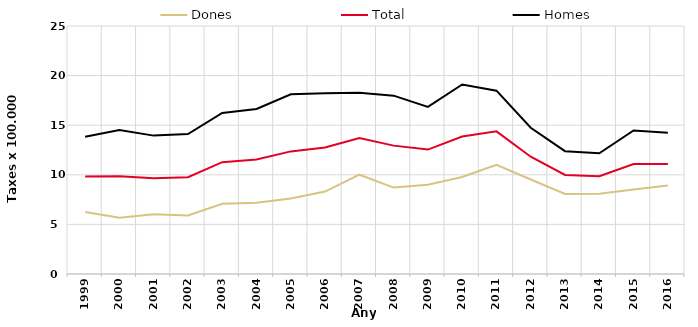
| Category | Dones | Total | Homes |
|---|---|---|---|
| 1999.0 | 6.26 | 9.84 | 13.83 |
| 2000.0 | 5.67 | 9.85 | 14.51 |
| 2001.0 | 6.02 | 9.66 | 13.95 |
| 2002.0 | 5.89 | 9.76 | 14.11 |
| 2003.0 | 7.07 | 11.27 | 16.24 |
| 2004.0 | 7.19 | 11.55 | 16.64 |
| 2005.0 | 7.61 | 12.36 | 18.11 |
| 2006.0 | 8.31 | 12.75 | 18.21 |
| 2007.0 | 10.01 | 13.7 | 18.26 |
| 2008.0 | 8.71 | 12.94 | 17.98 |
| 2009.0 | 8.99 | 12.54 | 16.85 |
| 2010.0 | 9.78 | 13.86 | 19.1 |
| 2011.0 | 11 | 14.38 | 18.48 |
| 2012.0 | 9.53 | 11.82 | 14.74 |
| 2013.0 | 8.07 | 9.98 | 12.38 |
| 2014.0 | 8.09 | 9.85 | 12.17 |
| 2015.0 | 8.51 | 11.09 | 14.47 |
| 2016.0 | 8.92 | 11.09 | 14.25 |